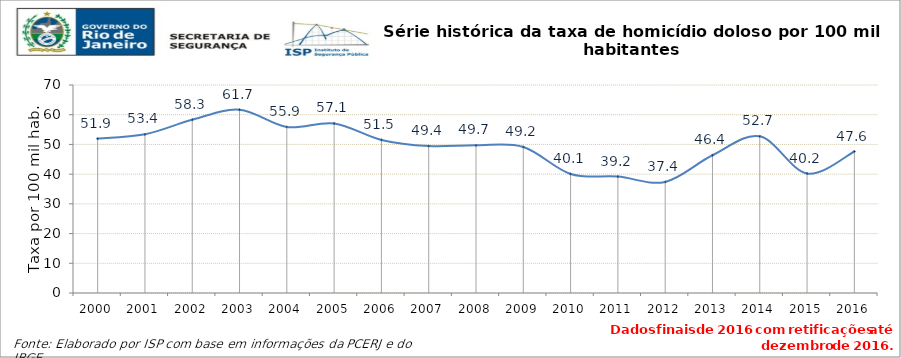
| Category | Series 0 |
|---|---|
| 2000.0 | 51.939 |
| 2001.0 | 53.399 |
| 2002.0 | 58.299 |
| 2003.0 | 61.675 |
| 2004.0 | 55.873 |
| 2005.0 | 57.071 |
| 2006.0 | 51.522 |
| 2007.0 | 49.445 |
| 2008.0 | 49.704 |
| 2009.0 | 49.153 |
| 2010.0 | 40.063 |
| 2011.0 | 39.174 |
| 2012.0 | 37.382 |
| 2013.0 | 46.364 |
| 2014.0 | 52.717 |
| 2015.0 | 40.214 |
| 2016.0 | 47.614 |